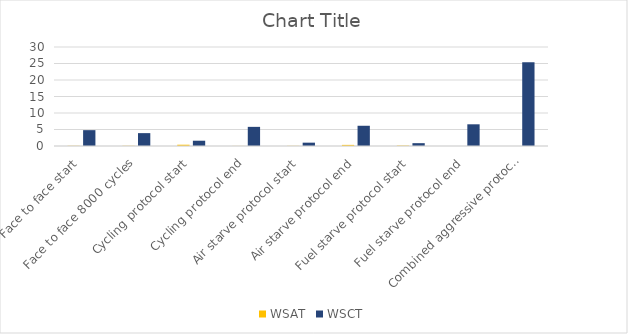
| Category | WSAT | WSCT |
|---|---|---|
| Face to face start | 0.063 | 4.8 |
| Face to face 8000 cycles | 0.063 | 3.9 |
| Cycling protocol start | 0.39 | 1.6 |
| Cycling protocol end | 0.024 | 5.8 |
| Air starve protocol start | 0.048 | 1.011 |
| Air starve protocol end | 0.34 | 6.131 |
| Fuel starve protocol start | 0.13 | 0.858 |
| Fuel starve protocol end | 0.002 | 6.576 |
| Combined aggressive protocol end | 0.003 | 25.36 |